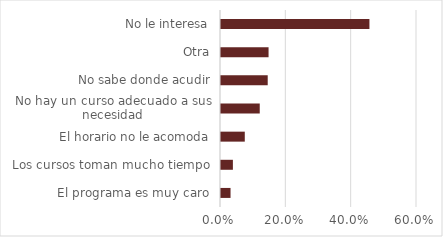
| Category | % |
|---|---|
| El programa es muy caro | 0.029 |
| Los cursos toman mucho tiempo | 0.036 |
| El horario no le acomoda | 0.073 |
| No hay un curso adecuado a sus necesidad | 0.119 |
| No sabe donde acudir | 0.143 |
| Otra | 0.146 |
| No le interesa | 0.454 |